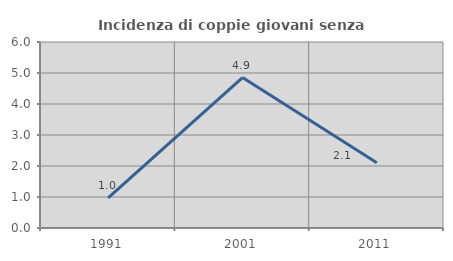
| Category | Incidenza di coppie giovani senza figli |
|---|---|
| 1991.0 | 0.971 |
| 2001.0 | 4.854 |
| 2011.0 | 2.105 |